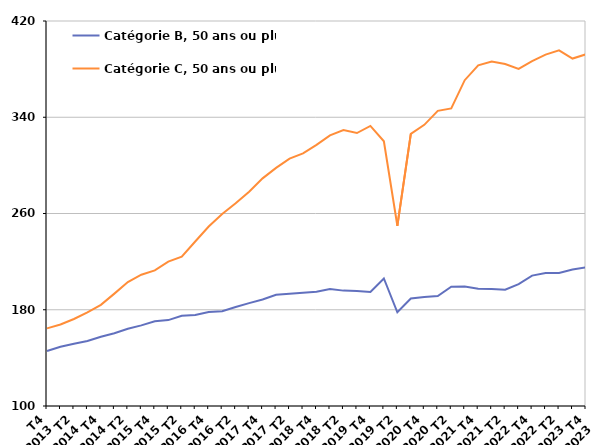
| Category | Catégorie B, 50 ans ou plus | Catégorie C, 50 ans ou plus |
|---|---|---|
| T4
2013 | 145.7 | 164.5 |
| T1
2014 | 149.2 | 167.7 |
| T2
2014 | 151.8 | 172.3 |
| T3
2014 | 154 | 177.9 |
| T4
2014 | 157.6 | 184.1 |
| T1
2015 | 160.5 | 193.4 |
| T2
2015 | 164.2 | 203 |
| T3
2015 | 167 | 209.1 |
| T4
2015 | 170.4 | 212.7 |
| T1
2016 | 171.4 | 220 |
| T2
2016 | 175 | 224.2 |
| T3
2016 | 175.7 | 236.7 |
| T4
2016 | 178.2 | 249.2 |
| T1
2017 | 178.8 | 259.6 |
| T2
2017 | 182.3 | 268.5 |
| T3
2017 | 185.5 | 278.1 |
| T4
2017 | 188.5 | 289.2 |
| T1
2018 | 192.4 | 297.9 |
| T2
2018 | 193.3 | 305.6 |
| T3
2018 | 194.2 | 310 |
| T4
2018 | 194.9 | 317 |
| T1
2019 | 197.3 | 324.9 |
| T2
2019 | 195.9 | 329.3 |
| T3
2019 | 195.5 | 326.9 |
| T4
2019 | 194.8 | 332.8 |
| T1
2020 | 206 | 320 |
| T2
2020 | 177.9 | 249.8 |
| T3
2020 | 189.3 | 326.2 |
| T4
2020 | 190.6 | 333.7 |
| T1
2021 | 191.4 | 345.3 |
| T2
2021 | 199.1 | 347.3 |
| T3
2021 | 199.3 | 370.8 |
| T4
2021 | 197.5 | 383.1 |
| T1
2022 | 197.3 | 386.3 |
| T2
2022 | 196.6 | 384.3 |
| T3
2022 | 201.3 | 380.2 |
| T4
2022 | 208.4 | 386.7 |
| T1
2023 | 210.6 | 392.1 |
| T2
2023 | 210.5 | 395.6 |
| T3
2023 | 213.4 | 388.8 |
| T4
2023 | 215.3 | 392.3 |